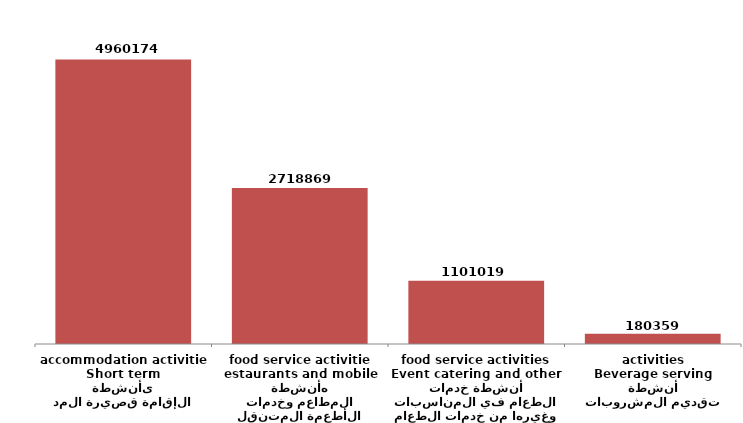
| Category | Series 0 |
|---|---|
| أنشطة الإقامة قصيرة المدى
Short term accommodation activities | 4960174 |
| أنشطة المطاعم وخدمات الأطعمة المتنقله
estaurants and mobile food service activities | 2718869 |
| أنشطة خدمات الطعام في المناسبات وغيرها من خدمات الطعام
Event catering and other food service activities | 1101019 |
| أنشطة تقديم المشروبات
Beverage serving activities | 180359 |